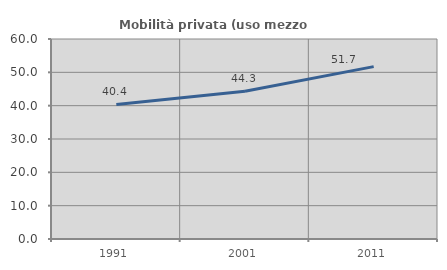
| Category | Mobilità privata (uso mezzo privato) |
|---|---|
| 1991.0 | 40.381 |
| 2001.0 | 44.336 |
| 2011.0 | 51.71 |